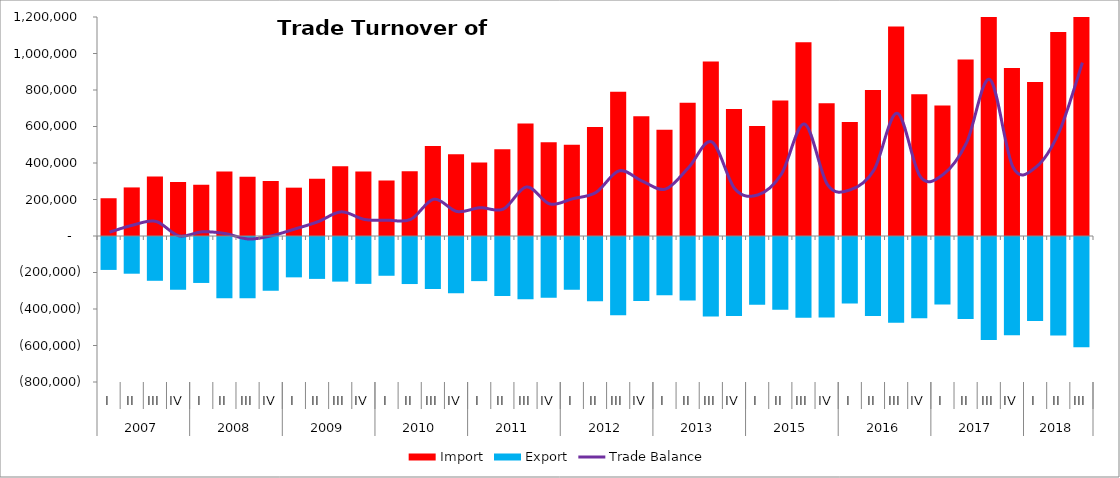
| Category | Import | Export |
|---|---|---|
| 0 | 206876.453 | -185862.119 |
| 1 | 266162.034 | -206602.171 |
| 2 | 325432.039 | -245424.789 |
| 3 | 295638.902 | -295030.919 |
| 4 | 280196.682 | -257248.178 |
| 5 | 354066.036 | -340846.499 |
| 6 | 324889.482 | -341447.222 |
| 7 | 301301.793 | -299882.459 |
| 8 | 264903.998 | -226561.536 |
| 9 | 313311.481 | -235037.426 |
| 10 | 382383.207 | -249991.263 |
| 11 | 353010.364 | -262293.067 |
| 12 | 304483.789 | -217879.02 |
| 13 | 354263.8 | -263232.936 |
| 14 | 492599.694 | -290888.678 |
| 15 | 447423.972 | -313316.693 |
| 16 | 402433.78 | -247232.2 |
| 17 | 475906.544 | -328431.291 |
| 18 | 616171.319 | -347095.2 |
| 19 | 513645.707 | -337933.603 |
| 20 | 499607.449 | -295085.361 |
| 21 | 596895.347 | -358072.392 |
| 22 | 791093.658 | -433796.826 |
| 23 | 656411.742 | -355854.896 |
| 24 | 582176.614 | -325310.604 |
| 25 | 729496.889 | -354020.424 |
| 26 | 956513.447 | -441031.269 |
| 27 | 695845.992 | -438198.975 |
| 28 | 602133.659 | -376572.246 |
| 29 | 742725.876 | -404597.572 |
| 30 | 1061185.775 | -447435.407 |
| 31 | 727096.737 | -446754.878 |
| 32 | 624569.616 | -370507.095 |
| 33 | 799859.375 | -438638.214 |
| 34 | 1147701.128 | -474916.674 |
| 35 | 776931.366 | -451354.128 |
| 36 | 714491.312 | -375970.87 |
| 37 | 967042.006 | -455164.095 |
| 38 | 1427808.272 | -569946.006 |
| 39 | 920988.9 | -543215 |
| 40 | 844143.887 | -465841.79 |
| 41 | 1117607.587 | -545310.986 |
| 42 | 1560170.948 | -610067.636 |